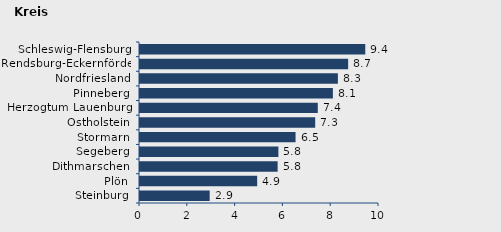
| Category | Wanderungssaldo |
|---|---|
| Steinburg | 2.916 |
| Plön | 4.903 |
| Dithmarschen | 5.759 |
| Segeberg | 5.791 |
| Stormarn | 6.508 |
| Ostholstein | 7.33 |
| Herzogtum Lauenburg | 7.439 |
| Pinneberg | 8.07 |
| Nordfriesland | 8.28 |
| Rendsburg-Eckernförde | 8.709 |
| Schleswig-Flensburg | 9.426 |